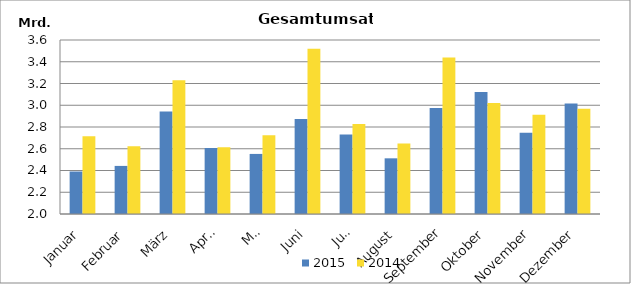
| Category | 2015 | 2014 |
|---|---|---|
| Januar | 2390878.552 | 2715233.459 |
| Februar | 2442199.719 | 2622325.747 |
| März | 2942839.86 | 3229261.369 |
| April | 2607381.301 | 2613968.521 |
| Mai | 2552476.783 | 2724815.789 |
| Juni | 2872540.076 | 3519997.88 |
| Juli | 2730830.302 | 2826614.319 |
| August | 2511985.36 | 2649321.124 |
| September | 2974504.883 | 3439874.069 |
| Oktober | 3121278.491 | 3021102.179 |
| November | 2748013.001 | 2913549.252 |
| Dezember | 3015500.346 | 2967297.04 |